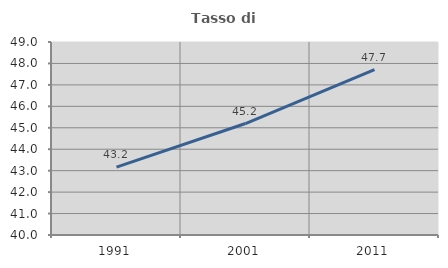
| Category | Tasso di occupazione   |
|---|---|
| 1991.0 | 43.165 |
| 2001.0 | 45.199 |
| 2011.0 | 47.706 |